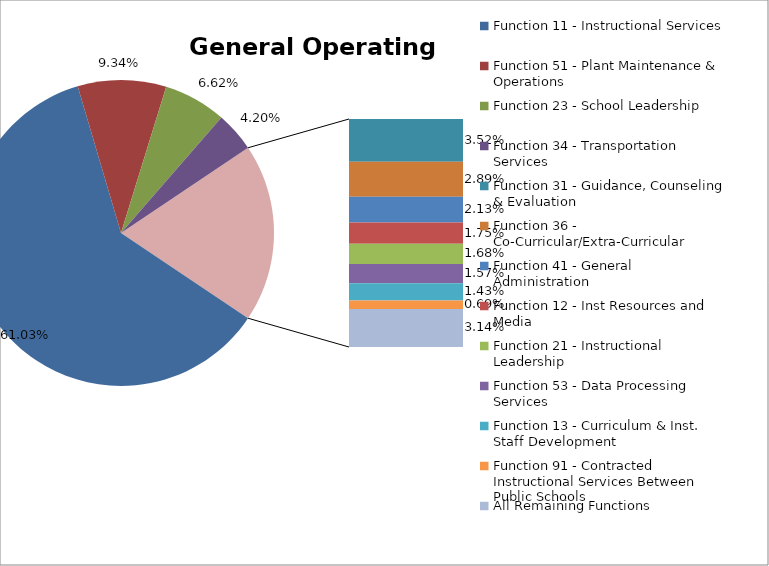
| Category | Series 0 |
|---|---|
| Function 11 - Instructional Services | 0.61 |
| Function 51 - Plant Maintenance & Operations | 0.093 |
| Function 23 - School Leadership | 0.066 |
| Function 34 - Transportation Services | 0.042 |
| Function 31 - Guidance, Counseling & Evaluation | 0.035 |
| Function 36 - Co-Curricular/Extra-Curricular | 0.029 |
| Function 41 - General Administration | 0.021 |
| Function 12 - Inst Resources and Media | 0.017 |
| Function 21 - Instructional Leadership | 0.017 |
| Function 53 - Data Processing Services | 0.016 |
| Function 13 - Curriculum & Inst. Staff Development | 0.014 |
| Function 91 - Contracted Instructional Services Between Public Schools | 0.007 |
| All Remaining Functions | 0.031 |